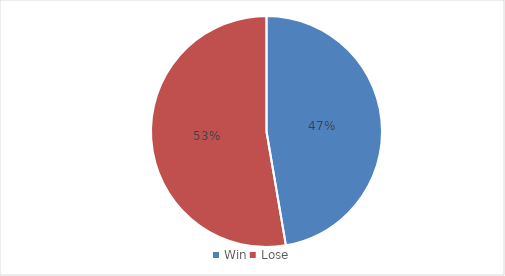
| Category | Series 0 |
|---|---|
| Win | 44 |
| Lose | 49 |